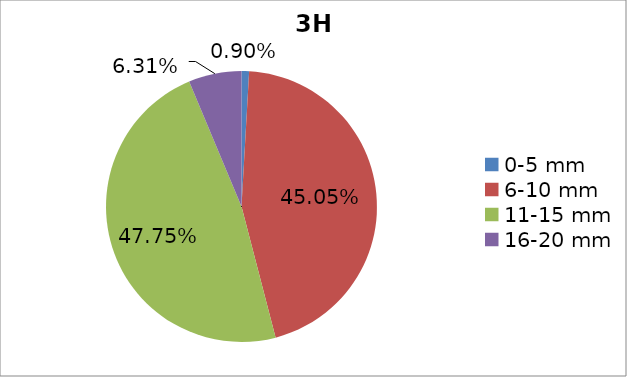
| Category | Series 0 |
|---|---|
| 0-5 mm | 0.009 |
| 6-10 mm | 0.45 |
| 11-15 mm | 0.478 |
| 16-20 mm | 0.063 |